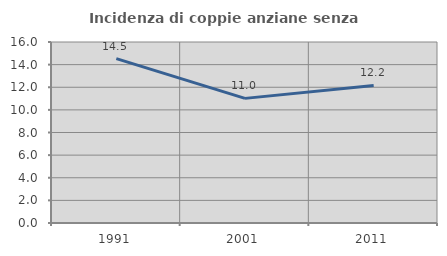
| Category | Incidenza di coppie anziane senza figli  |
|---|---|
| 1991.0 | 14.53 |
| 2001.0 | 11.017 |
| 2011.0 | 12.157 |